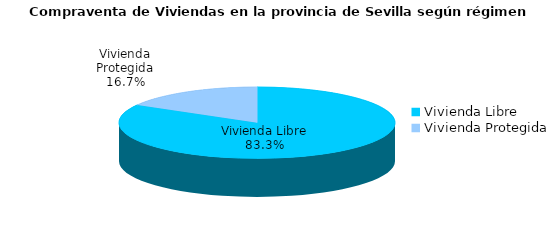
| Category | Series 0 | Series 1 |
|---|---|---|
| Vivienda Libre | 787 | 0.833 |
| Vivienda Protegida | 158 | 0.167 |